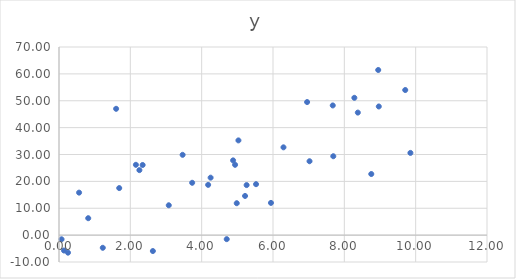
| Category | y |
|---|---|
| 8.950284933076244 | 61.442 |
| 4.702685405158915 | -1.498 |
| 2.63166184438149 | -5.924 |
| 9.852744543749996 | 30.591 |
| 8.755935361689303 | 22.737 |
| 8.966201389807633 | 47.872 |
| 8.378245187432993 | 45.595 |
| 5.2165742803119635 | 14.573 |
| 0.5629489596937509 | 15.81 |
| 5.260355347590227 | 18.622 |
| 4.181680971370113 | 18.703 |
| 5.943061469753003 | 11.991 |
| 7.690447516102623 | 29.357 |
| 9.707829999990059 | 53.992 |
| 6.293753884765905 | 32.666 |
| 8.28105631207346 | 51.088 |
| 4.881132233586587 | 27.815 |
| 1.2277703594822886 | -4.716 |
| 3.733963675240565 | 19.474 |
| 0.07181284404157773 | -1.549 |
| 7.675338717045205 | 48.251 |
| 5.030519677430403 | 35.246 |
| 4.936592333844356 | 26.167 |
| 5.524512495919993 | 18.959 |
| 0.1403802152587419 | -5.728 |
| 7.024191438961408 | 27.491 |
| 1.6013818538675495 | 47.003 |
| 6.956344679768219 | 49.515 |
| 3.077721379057018 | 11.11 |
| 4.251004169571251 | 21.379 |
| 2.254291183224253 | 24.183 |
| 2.1560592175490765 | 26.165 |
| 0.8192544657530831 | 6.295 |
| 2.3449603733355073 | 26.099 |
| 3.46604431428975 | 29.876 |
| 0.2520411663464417 | -6.527 |
| 1.688622521391725 | 17.508 |
| 4.983580384482263 | 11.873 |